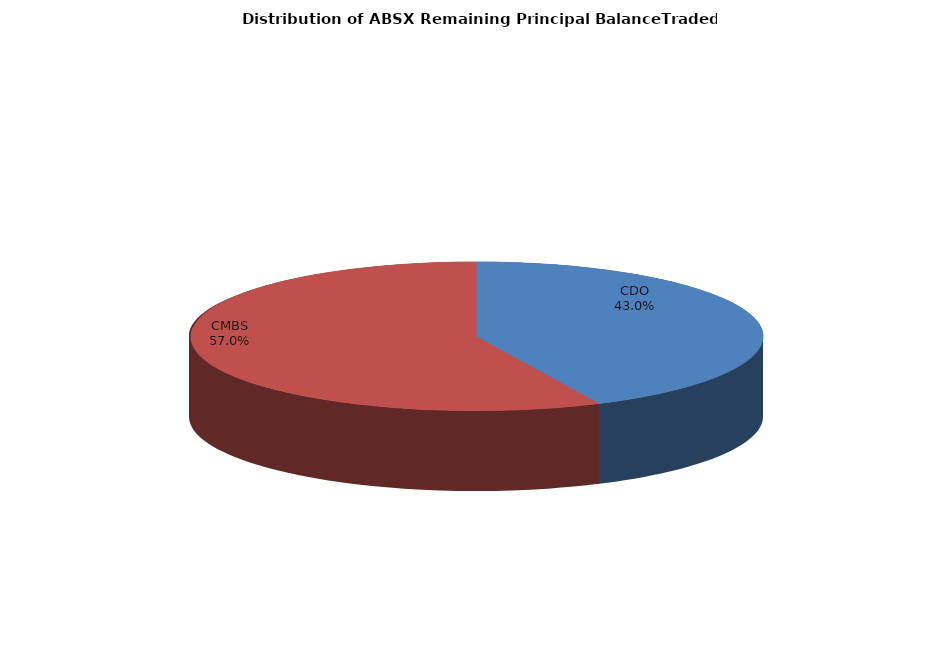
| Category | Series 0 |
|---|---|
| CDO | 993709358.801 |
| CMBS | 1319444051.969 |